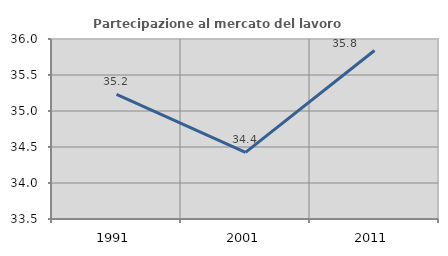
| Category | Partecipazione al mercato del lavoro  femminile |
|---|---|
| 1991.0 | 35.23 |
| 2001.0 | 34.426 |
| 2011.0 | 35.841 |